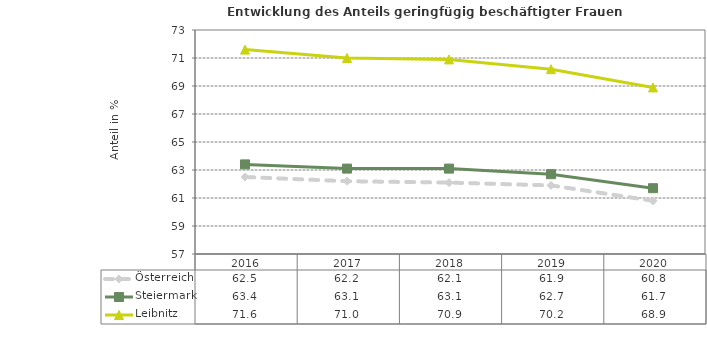
| Category | Österreich | Steiermark | Leibnitz |
|---|---|---|---|
| 2020.0 | 60.8 | 61.7 | 68.9 |
| 2019.0 | 61.9 | 62.7 | 70.2 |
| 2018.0 | 62.1 | 63.1 | 70.9 |
| 2017.0 | 62.2 | 63.1 | 71 |
| 2016.0 | 62.5 | 63.4 | 71.6 |